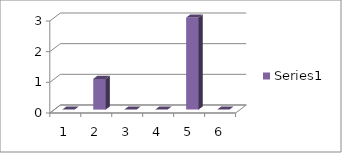
| Category | Series 0 |
|---|---|
| 0 | 0 |
| 1 | 1 |
| 2 | 0 |
| 3 | 0 |
| 4 | 3 |
| 5 | 0 |